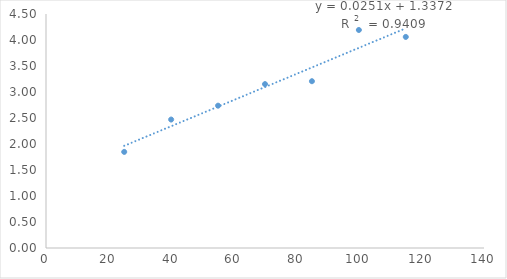
| Category | Series 0 |
|---|---|
| 25.0 | 1.848 |
| 40.0 | 2.47 |
| 55.0 | 2.737 |
| 70.0 | 3.152 |
| 85.0 | 3.207 |
| 100.0 | 4.193 |
| 115.0 | 4.059 |